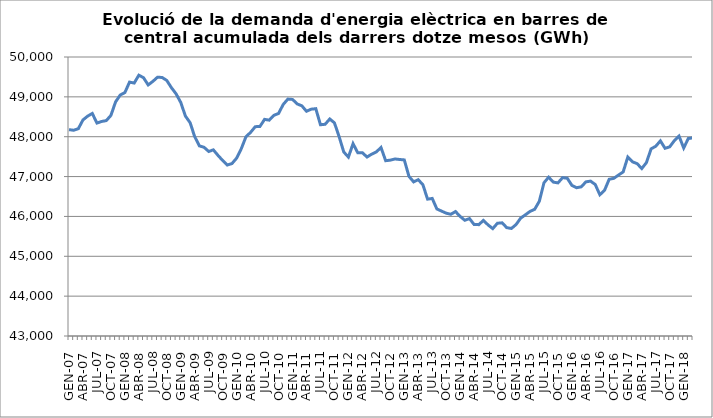
| Category | Series 0 |
|---|---|
| GEN-07 | 48177.203 |
| FEB-07 | 48162.221 |
| MAR-07 | 48200.694 |
| ABR-07 | 48421.605 |
| MAI-07 | 48515.9 |
| JUN-07 | 48583.508 |
| JUL-07 | 48342.496 |
| AGO-07 | 48382.702 |
| SET-07 | 48403.751 |
| OCT-07 | 48534.433 |
| NOV-07 | 48873.682 |
| DES-07 | 49045.917 |
| GEN-08 | 49107.897 |
| FEB-08 | 49370.48 |
| MAR-08 | 49346.658 |
| ABR-08 | 49543.697 |
| MAI-08 | 49480.815 |
| JUN-08 | 49299.316 |
| JUL-08 | 49387.462 |
| AGO-08 | 49492.418 |
| SET-08 | 49486.813 |
| OCT-08 | 49410.659 |
| NOV-08 | 49228.841 |
| DES-08 | 49075.002 |
| GEN-09 | 48859.398 |
| FEB-09 | 48517.363 |
| MAR-09 | 48353.027 |
| ABR-09 | 47999.689 |
| MAI-09 | 47770.142 |
| JUN-09 | 47734.653 |
| JUL-09 | 47629.852 |
| AGO-09 | 47670.031 |
| SET-09 | 47530.801 |
| OCT-09 | 47403.064 |
| NOV-09 | 47290.163 |
| DES-09 | 47326.848 |
| GEN-10 | 47462.94 |
| FEB-10 | 47699.994 |
| MAR-10 | 47998.705 |
| ABR-10 | 48109.679 |
| MAI-10 | 48251.912 |
| JUN-10 | 48257.01 |
| JUL-10 | 48435.503 |
| AGO-10 | 48415.71 |
| SET-10 | 48537.033 |
| OCT-10 | 48583.513 |
| NOV-10 | 48809.029 |
| DES-10 | 48943.974 |
| GEN-11 | 48935.267 |
| FEB-11 | 48822.572 |
| MAR-11 | 48775.674 |
| ABR-11 | 48638.496 |
| MAI-11 | 48690.936 |
| JUN-11 | 48703.122 |
| JUL-11 | 48300.126 |
| AGO-11 | 48312.09 |
| SET-11 | 48445.098 |
| OCT-11 | 48347.204 |
| NOV-11 | 48005.399 |
| DES-11 | 47617.644 |
| GEN-12 | 47488.541 |
| FEB-12 | 47824.808 |
| MAR-12 | 47599.6 |
| ABR-12 | 47597.997 |
| MAI-12 | 47490.802 |
| JUN-12 | 47562.191 |
| JUL-12 | 47618.321 |
| AGO-12 | 47729.471 |
| SET-12 | 47398.91 |
| OCT-12 | 47411.819 |
| NOV-12 | 47441.51 |
| DES-12 | 47428.773 |
| GEN-13 | 47418.135 |
| FEB-13 | 47006.78 |
| MAR-13 | 46866.849 |
| ABR-13 | 46922.047 |
| MAI-13 | 46793.965 |
| JUN-13 | 46433.655 |
| JUL-13 | 46451.267 |
| AGO-13 | 46187.333 |
| SET-13 | 46133.886 |
| OCT-13 | 46081.488 |
| NOV-13 | 46054.45 |
| DES-13 | 46122.424 |
| GEN-14 | 45999.595 |
| FEB-14 | 45903.527 |
| MAR-14 | 45945.925 |
| ABR-14 | 45796.304 |
| MAI-14 | 45794.079 |
| JUN-14 | 45900.694 |
| JUL-14 | 45785.89 |
| AGO-14 | 45694.131 |
| SET-14 | 45828.93 |
| OCT-14 | 45839.148 |
| NOV-14 | 45718.651 |
| DES-14 | 45697.665 |
| GEN-15 | 45795.921 |
| FEB-15 | 45958.019 |
| MAR-15 | 46040.232 |
| ABR-15 | 46125.775 |
| MAI-15 | 46178.444 |
| JUN-15 | 46381.545 |
| JUL-15 | 46845.273 |
| AGO-15 | 46984.93 |
| SET-15 | 46860.871 |
| OCT-15 | 46841.48 |
| NOV-15 | 46973.609 |
| DES-15 | 46957.8 |
| GEN-16 | 46777.658 |
| FEB-16 | 46720.389 |
| MAR-16 | 46742.594 |
| ABR-16 | 46866.71 |
| MAI-16 | 46885.851 |
| JUN-16 | 46801.83 |
| JUL-16 | 46544.22 |
| AGO-16 | 46654.462 |
| SET-16 | 46932.429 |
| OCT-16 | 46956.294 |
| NOV-16 | 47037.388 |
| DES-16 | 47116.261 |
| GEN-17 | 47488.504 |
| FEB-17 | 47370.431 |
| MAR-17 | 47324.15 |
| ABR-17 | 47201.49 |
| MAI-17 | 47350.747 |
| JUN-17 | 47695.16 |
| JUL-17 | 47761.292 |
| AGO-17 | 47896.145 |
| SET-17 | 47709.285 |
| OCT-17 | 47746.924 |
| NOV-17 | 47902.664 |
| DES-17 | 48015.826 |
| GEN-18 | 47718.264 |
| FEB-18 | 47954.989 |
| MAR-18 | 47970.447 |